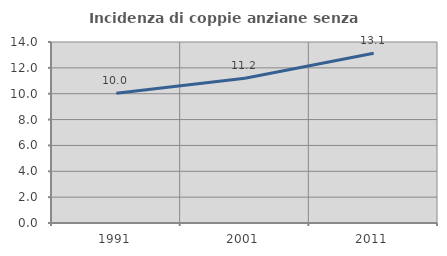
| Category | Incidenza di coppie anziane senza figli  |
|---|---|
| 1991.0 | 10.032 |
| 2001.0 | 11.192 |
| 2011.0 | 13.135 |